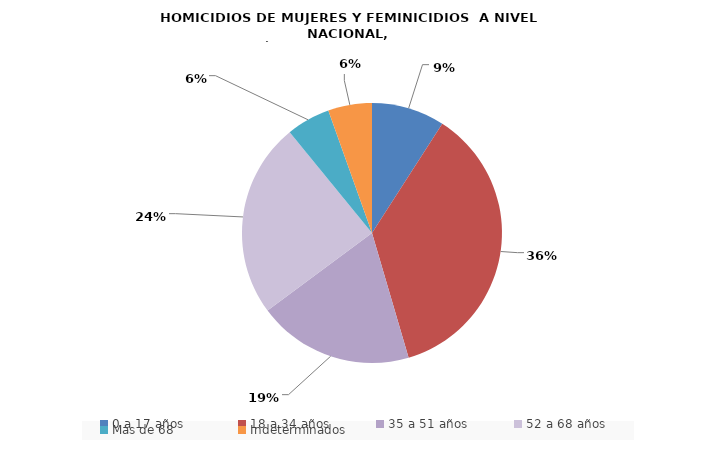
| Category | Series 0 |
|---|---|
| 0 a 17 años | 15 |
| 18 a 34 años | 60 |
| 35 a 51 años | 32 |
| 52 a 68 años | 40 |
| Más de 68 | 9 |
| Indeterminados | 9 |